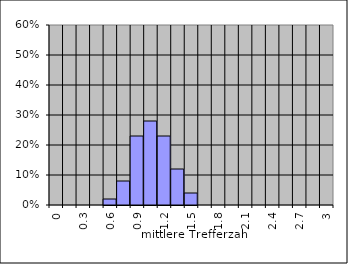
| Category | Series 0 |
|---|---|
| 0.0 | 0 |
| 0.15 | 0 |
| 0.3 | 0 |
| 0.45 | 0 |
| 0.6 | 0.02 |
| 0.750000000000001 | 0.08 |
| 0.900000000000001 | 0.23 |
| 1.05 | 0.28 |
| 1.2 | 0.23 |
| 1.35 | 0.12 |
| 1.5 | 0.04 |
| 1.65 | 0 |
| 1.8 | 0 |
| 1.95 | 0 |
| 2.1 | 0 |
| 2.25 | 0 |
| 2.4 | 0 |
| 2.55 | 0 |
| 2.7 | 0 |
| 2.85 | 0 |
| 3.0 | 0 |